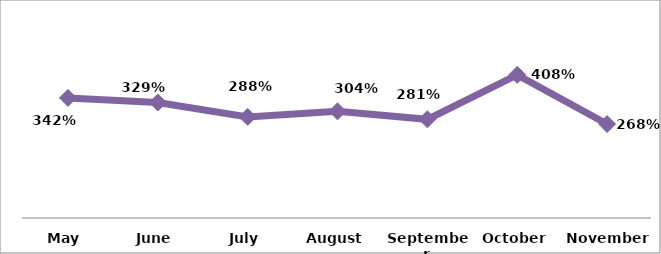
| Category | PERCENTAGE |
|---|---|
| May | 3.42 |
| June | 3.289 |
| July | 2.88 |
| August | 3.039 |
| September | 2.811 |
| October | 4.077 |
| November | 2.676 |